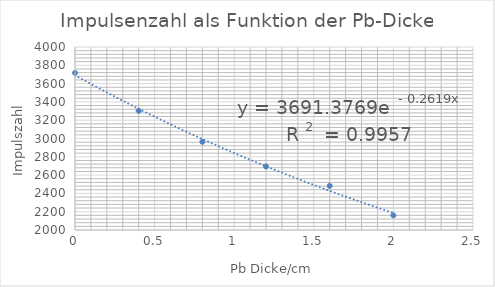
| Category | Impulszahl/10 s |
|---|---|
| 0.0 | 3717 |
| 0.4 | 3303 |
| 0.8 | 2964 |
| 1.2 | 2694 |
| 1.6 | 2482 |
| 2.0 | 2160 |